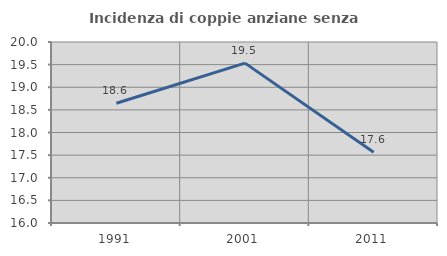
| Category | Incidenza di coppie anziane senza figli  |
|---|---|
| 1991.0 | 18.648 |
| 2001.0 | 19.533 |
| 2011.0 | 17.564 |